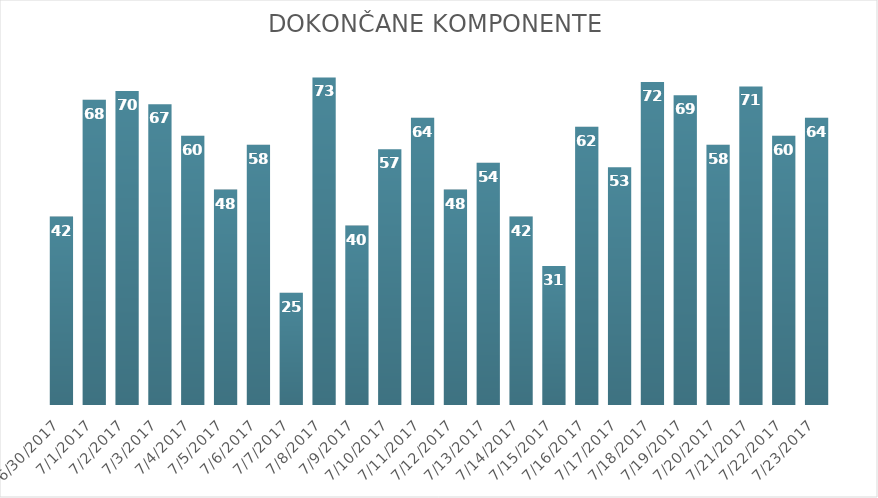
| Category | Dokončane komponente |
|---|---|
| 6/30/17 | 42 |
| 7/1/17 | 68 |
| 7/2/17 | 70 |
| 7/3/17 | 67 |
| 7/4/17 | 60 |
| 7/5/17 | 48 |
| 7/6/17 | 58 |
| 7/7/17 | 25 |
| 7/8/17 | 73 |
| 7/9/17 | 40 |
| 7/10/17 | 57 |
| 7/11/17 | 64 |
| 7/12/17 | 48 |
| 7/13/17 | 54 |
| 7/14/17 | 42 |
| 7/15/17 | 31 |
| 7/16/17 | 62 |
| 7/17/17 | 53 |
| 7/18/17 | 72 |
| 7/19/17 | 69 |
| 7/20/17 | 58 |
| 7/21/17 | 71 |
| 7/22/17 | 60 |
| 7/23/17 | 64 |